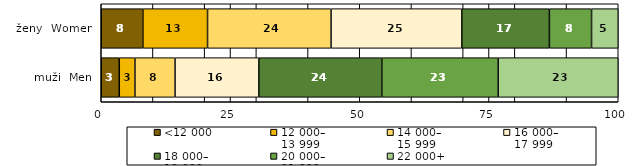
| Category | <12 000 | 12 000–
13 999 | 14 000–
15 999 | 16 000–
17 999 | 18 000–
19 999 | 20 000–
21 999 | 22 000+ |
|---|---|---|---|---|---|---|---|
| muži  Men | 3.485 | 3.03 | 7.759 | 16.211 | 23.784 | 22.504 | 23.228 |
| ženy  Women | 8.059 | 12.501 | 23.893 | 25.29 | 16.94 | 8.153 | 5.165 |